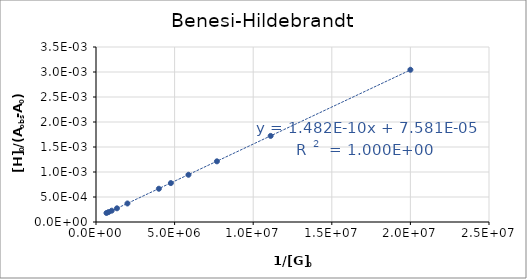
| Category | 325 nm |
|---|---|
| 20000000.0 | 0.003 |
| 11111111.111111112 | 0.002 |
| 7692307.692307692 | 0.001 |
| 5882352.94117647 | 0.001 |
| 4761904.761904762 | 0.001 |
| 4000000.0 | 0.001 |
| 2000000.0 | 0 |
| 1333333.3333333333 | 0 |
| 1000000.0 | 0 |
| 800000.0000000001 | 0 |
| 666666.6666666666 | 0 |